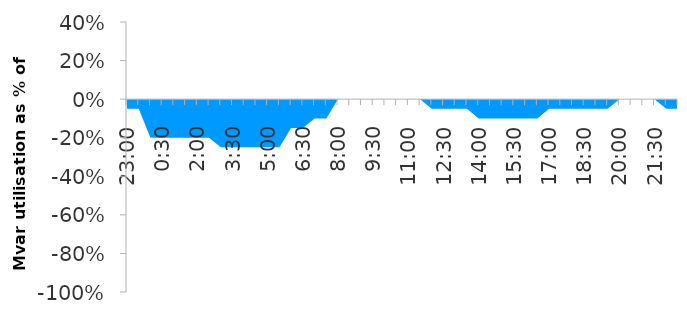
| Category | Series 1 |
|---|---|
| 0.9583333333333334 | -0.05 |
| 0.9791666666666666 | -0.05 |
| 0.0 | -0.2 |
| 0.020833333333333332 | -0.2 |
| 0.041666666666666664 | -0.2 |
| 0.0625 | -0.2 |
| 0.08333333333333333 | -0.2 |
| 0.10416666666666667 | -0.2 |
| 0.125 | -0.25 |
| 0.14583333333333334 | -0.25 |
| 0.16666666666666666 | -0.25 |
| 0.1875 | -0.25 |
| 0.20833333333333334 | -0.25 |
| 0.22916666666666666 | -0.25 |
| 0.25 | -0.15 |
| 0.2708333333333333 | -0.15 |
| 0.2916666666666667 | -0.1 |
| 0.3125 | -0.1 |
| 0.3333333333333333 | 0 |
| 0.3541666666666667 | 0 |
| 0.375 | 0 |
| 0.3958333333333333 | 0 |
| 0.4166666666666667 | 0 |
| 0.4375 | 0 |
| 0.4583333333333333 | 0 |
| 0.4791666666666667 | 0 |
| 0.5 | -0.05 |
| 0.5208333333333334 | -0.05 |
| 0.5416666666666666 | -0.05 |
| 0.5625 | -0.05 |
| 0.5833333333333334 | -0.1 |
| 0.6041666666666666 | -0.1 |
| 0.625 | -0.1 |
| 0.6458333333333334 | -0.1 |
| 0.6666666666666666 | -0.1 |
| 0.6875 | -0.1 |
| 0.7083333333333334 | -0.05 |
| 0.7291666666666666 | -0.05 |
| 0.75 | -0.05 |
| 0.7708333333333334 | -0.05 |
| 0.7916666666666666 | -0.05 |
| 0.8125 | -0.05 |
| 0.8333333333333334 | 0 |
| 0.8541666666666666 | 0 |
| 0.875 | 0 |
| 0.8958333333333334 | 0 |
| 0.9166666666666666 | -0.05 |
| 0.9375 | -0.05 |